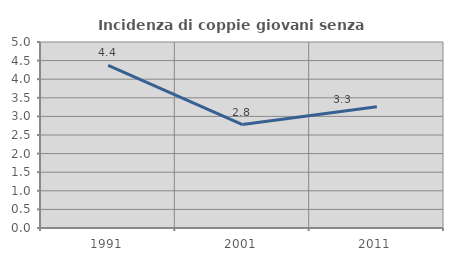
| Category | Incidenza di coppie giovani senza figli |
|---|---|
| 1991.0 | 4.372 |
| 2001.0 | 2.779 |
| 2011.0 | 3.257 |